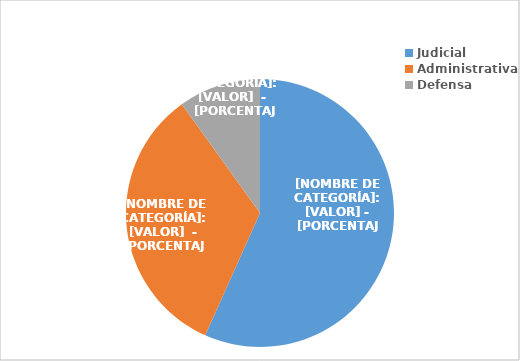
| Category | Series 0 |
|---|---|
| Judicial | 423 |
| Administrativa | 249 |
| Defensa | 74 |